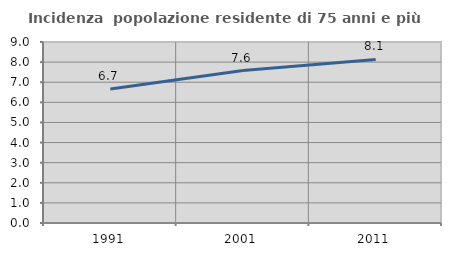
| Category | Incidenza  popolazione residente di 75 anni e più |
|---|---|
| 1991.0 | 6.664 |
| 2001.0 | 7.579 |
| 2011.0 | 8.132 |